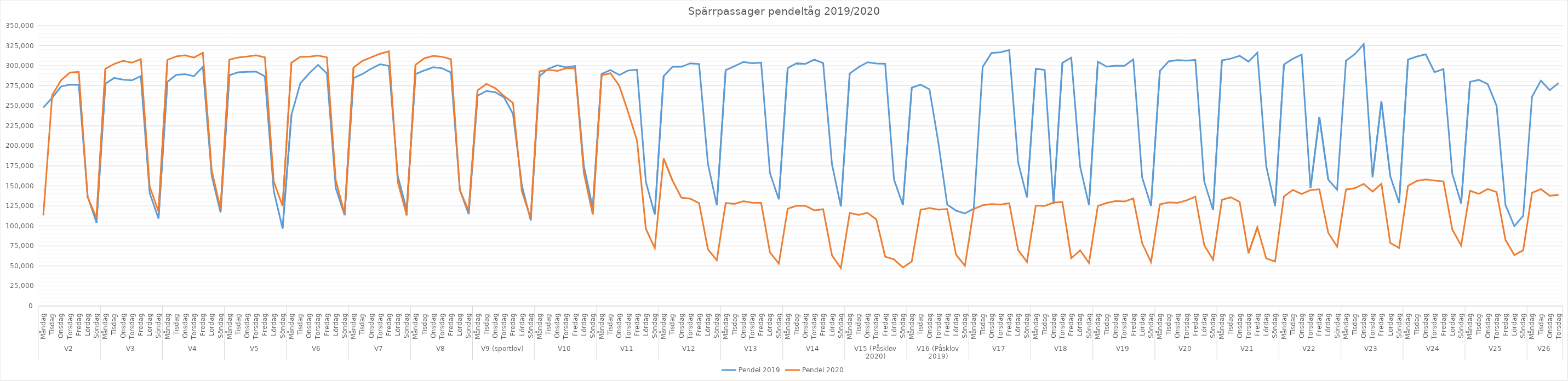
| Category | Pendel 2019 | Pendel 2020 |
|---|---|---|
| 0 | 247815 | 113215 |
| 1 | 260132 | 263409 |
| 2 | 274092 | 281881 |
| 3 | 276506 | 291496 |
| 4 | 276239 | 292309 |
| 5 | 136814 | 135788 |
| 6 | 104006 | 110115 |
| 7 | 277560 | 296283 |
| 8 | 284768 | 302300 |
| 9 | 282672 | 306244 |
| 10 | 281774 | 303950 |
| 11 | 287136 | 308181 |
| 12 | 141042 | 149253 |
| 13 | 109163 | 118057 |
| 14 | 279942 | 307326 |
| 15 | 288592 | 311792 |
| 16 | 289495 | 313102 |
| 17 | 286991 | 310219 |
| 18 | 298514 | 316150 |
| 19 | 162711 | 169255 |
| 20 | 116748 | 121290 |
| 21 | 288211 | 307715 |
| 22 | 291847 | 310304 |
| 23 | 292380 | 311477 |
| 24 | 292776 | 313067 |
| 25 | 286845 | 310528 |
| 26 | 143678 | 155545 |
| 27 | 96817 | 124791 |
| 28 | 238614 | 303944 |
| 29 | 278088 | 311181 |
| 30 | 290517 | 311338 |
| 31 | 301100 | 312745 |
| 32 | 290453 | 310471 |
| 33 | 147105 | 156891 |
| 34 | 113420 | 115154 |
| 35 | 284572 | 297745 |
| 36 | 289710 | 305999 |
| 37 | 296341 | 310677 |
| 38 | 301902 | 315010 |
| 39 | 299674 | 318059 |
| 40 | 162425 | 155001 |
| 41 | 120123 | 113260 |
| 42 | 289609 | 301305 |
| 43 | 294127 | 309356 |
| 44 | 298127 | 312431 |
| 45 | 296865 | 311265 |
| 46 | 291697 | 308146 |
| 47 | 145035 | 144911 |
| 48 | 114751 | 118897 |
| 49 | 262569 | 269260 |
| 50 | 268488 | 277366 |
| 51 | 266985 | 272023 |
| 52 | 260431 | 262153 |
| 53 | 239885 | 253574 |
| 54 | 150832 | 143151 |
| 55 | 106717 | 109660 |
| 56 | 287079 | 293102 |
| 57 | 296380 | 294942 |
| 58 | 300541 | 293588 |
| 59 | 297994 | 296833 |
| 60 | 299544 | 296913 |
| 61 | 174731 | 165704 |
| 62 | 122288 | 114341 |
| 63 | 289869 | 288085 |
| 64 | 294652 | 290740 |
| 65 | 288477 | 274831 |
| 66 | 294119 | 242003 |
| 67 | 295061 | 206407 |
| 68 | 154677 | 96217 |
| 69 | 114388 | 72326 |
| 70 | 287042 | 184242 |
| 71 | 298746 | 156567 |
| 72 | 298695 | 135340 |
| 73 | 303028 | 134038 |
| 74 | 302207 | 128469 |
| 75 | 177581 | 70726 |
| 76 | 125979 | 57138 |
| 77 | 294593 | 128580 |
| 78 | 299509 | 127480 |
| 79 | 304702 | 130893 |
| 80 | 303171 | 128961 |
| 81 | 303909 | 128931 |
| 82 | 165752 | 66890 |
| 83 | 133169 | 52975 |
| 84 | 297046 | 121488 |
| 85 | 303157 | 125276 |
| 86 | 302349 | 125152 |
| 87 | 307631 | 119505 |
| 88 | 303516 | 120858 |
| 89 | 176656 | 63073 |
| 90 | 124346 | 47467 |
| 91 | 290398 | 116168 |
| 92 | 298272 | 113915 |
| 93 | 304362 | 116286 |
| 94 | 302774 | 108221 |
| 95 | 302509 | 61608 |
| 96 | 157951 | 58149 |
| 97 | 126055 | 48097 |
| 98 | 272616 | 55563 |
| 99 | 276372 | 120097 |
| 100 | 270512 | 122265 |
| 101 | 204319 | 120282 |
| 102 | 126713 | 121116 |
| 103 | 119094 | 64102 |
| 104 | 115559 | 50251 |
| 105 | 121641 | 121061 |
| 106 | 298501 | 125865 |
| 107 | 316028 | 127307 |
| 108 | 316880 | 126718 |
| 109 | 319581 | 128391 |
| 110 | 179597 | 69892 |
| 111 | 135833 | 55029 |
| 112 | 296385 | 125441 |
| 113 | 294703 | 125010 |
| 114 | 127517 | 129134 |
| 115 | 303730 | 129912 |
| 116 | 310094 | 59606 |
| 117 | 174205 | 69567 |
| 118 | 126004 | 53819 |
| 119 | 305145 | 124925 |
| 120 | 298903 | 128697 |
| 121 | 300079 | 131035 |
| 122 | 299998 | 130527 |
| 123 | 308008 | 134331 |
| 124 | 160508 | 78404 |
| 125 | 124949 | 54970 |
| 126 | 293547 | 126909 |
| 127 | 305567 | 129325 |
| 128 | 307150 | 128845 |
| 129 | 306408 | 131856 |
| 130 | 307411 | 136545 |
| 131 | 155793 | 76255 |
| 132 | 119688 | 57716 |
| 133 | 306789 | 132655 |
| 134 | 308915 | 135728 |
| 135 | 312439 | 130089 |
| 136 | 305159 | 65739 |
| 137 | 316445 | 98295 |
| 138 | 174788 | 59442 |
| 139 | 124844 | 55545 |
| 140 | 301605 | 136848 |
| 141 | 308688 | 144924 |
| 142 | 313982 | 139926 |
| 143 | 147060 | 144788 |
| 144 | 235833 | 145719 |
| 145 | 157868 | 91440 |
| 146 | 145346 | 74113 |
| 147 | 306383 | 145501 |
| 148 | 314476 | 147105 |
| 149 | 327010 | 152474 |
| 150 | 160828 | 142938 |
| 151 | 255489 | 152672 |
| 152 | 162146 | 78676 |
| 153 | 128839 | 72485 |
| 154 | 307784 | 150088 |
| 155 | 311522 | 156223 |
| 156 | 314284 | 158119 |
| 157 | 291955 | 156626 |
| 158 | 295958 | 155651 |
| 159 | 165272 | 95487 |
| 160 | 127952 | 75619 |
| 161 | 279931 | 143845 |
| 162 | 282418 | 140092 |
| 163 | 277138 | 146031 |
| 164 | 249912 | 142335 |
| 165 | 126282 | 82634 |
| 166 | 99637 | 63611 |
| 167 | 112694 | 69606 |
| 168 | 261531 | 141458 |
| 169 | 281386 | 145942 |
| 170 | 269487 | 137671 |
| 171 | 278488 | 138696 |